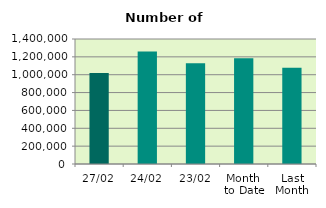
| Category | Series 0 |
|---|---|
| 27/02 | 1020150 |
| 24/02 | 1259860 |
| 23/02 | 1129286 |
| Month 
to Date | 1185178.947 |
| Last
Month | 1077187.636 |